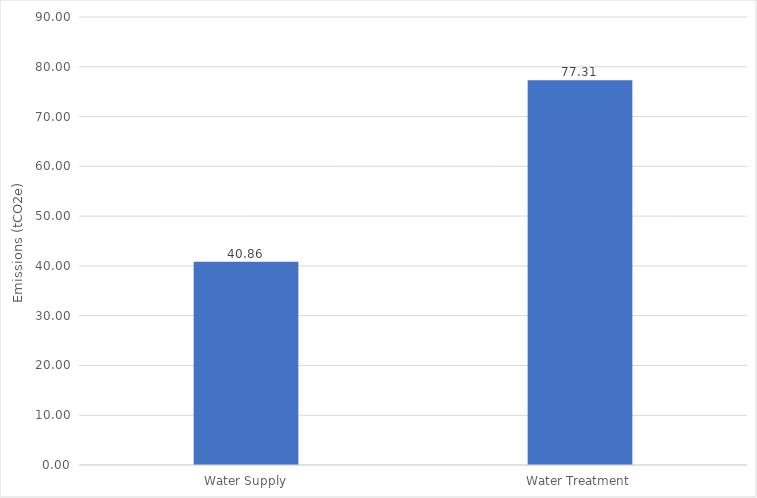
| Category | Emissions
(tCO2e) |
|---|---|
| Water Supply | 40.856 |
| Water Treatment | 77.306 |